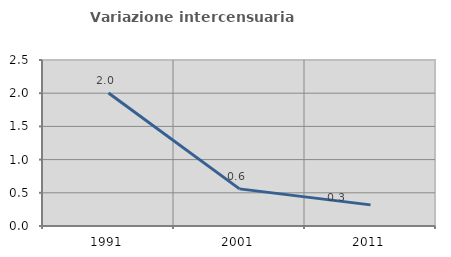
| Category | Variazione intercensuaria annua |
|---|---|
| 1991.0 | 2.003 |
| 2001.0 | 0.559 |
| 2011.0 | 0.318 |